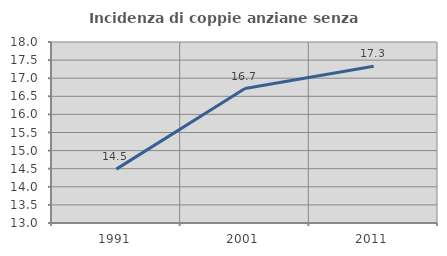
| Category | Incidenza di coppie anziane senza figli  |
|---|---|
| 1991.0 | 14.489 |
| 2001.0 | 16.715 |
| 2011.0 | 17.33 |